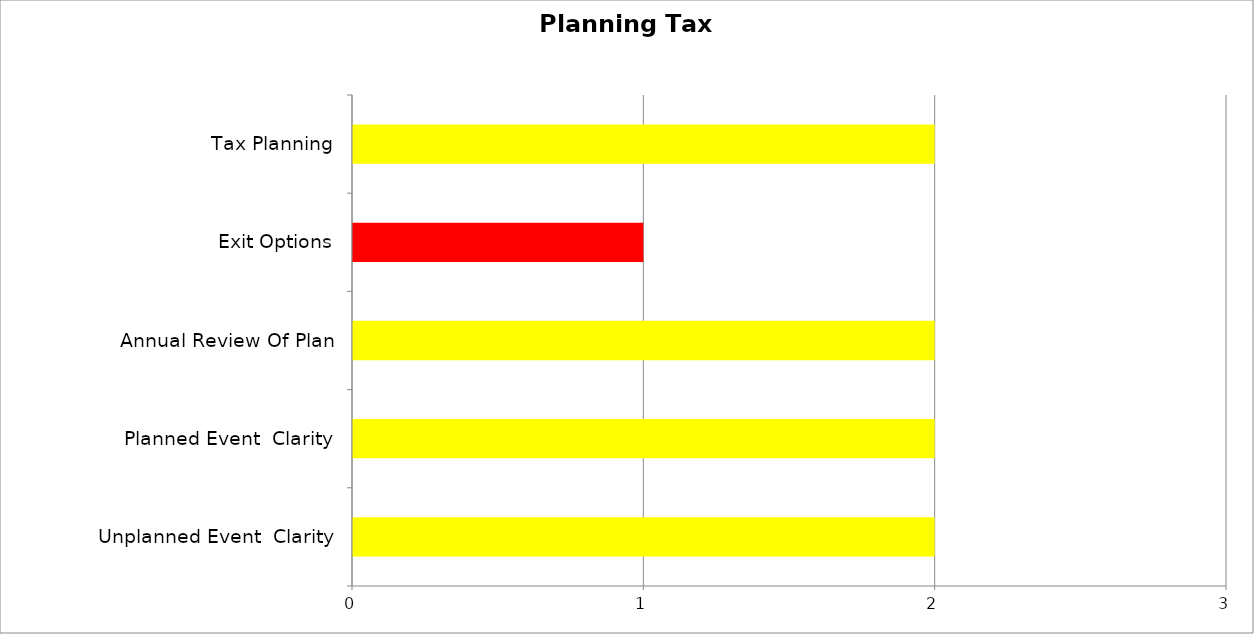
| Category | Series 0 | Series 1 | Series 2 |
|---|---|---|---|
| Unplanned Event  Clarity | 0 | 2 | 0 |
| Planned Event  Clarity | 0 | 2 | 0 |
| Annual Review Of Plan | 0 | 2 | 0 |
| Exit Options | 0 | 0 | 1 |
| Tax Planning | 0 | 2 | 0 |